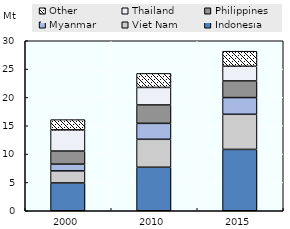
| Category | Indonesia | Viet Nam | Myanmar | Philippines | Thailand | Other |
|---|---|---|---|---|---|---|
| 2000.0 | 4903.554 | 2128.129 | 1192.112 | 2311.561 | 3735.279 | 1811.132 |
| 2010.0 | 7678.331 | 4932.807 | 2811.847 | 3244.885 | 3096.742 | 2469.822 |
| 2015.0 | 10827.785 | 6195.692 | 2950.816 | 2933.3 | 2590.146 | 2660.508 |